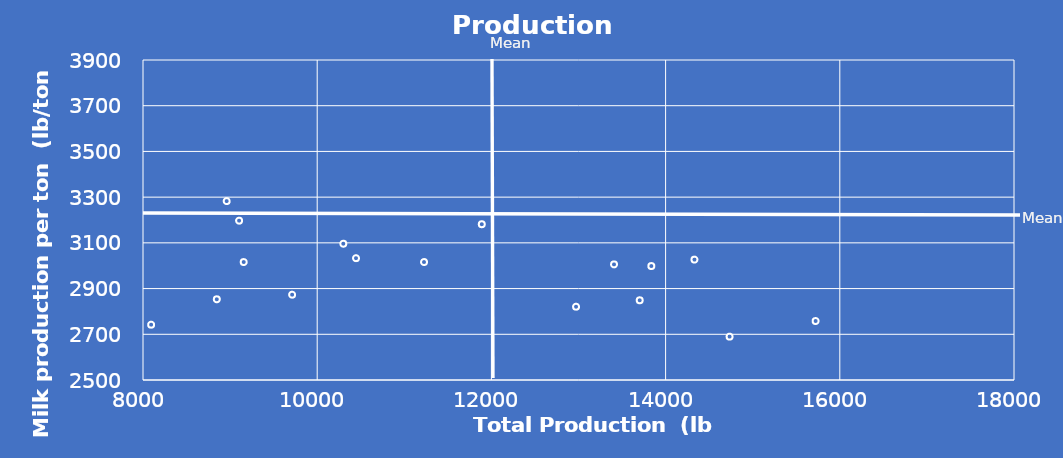
| Category | Series 0 |
|---|---|
| 11226.30080857 | 3016.111 |
| 10299.809243652 | 3096.25 |
| 14331.423669091 | 3026.75 |
| 12971.878860451 | 2820.75 |
| 13836.199827433 | 2998.5 |
| 9102.986205088 | 3197 |
| 13407.941755703 | 3005.75 |
| 9711.954492898 | 2873.25 |
| 8093.288294985 | 2742 |
| 9156.140969054 | 3016 |
| 11889.582025416 | 3181.5 |
| 14734.491967108 | 2689.75 |
| 15722.501196678 | 2758 |
| 10445.378342182 | 3033 |
| 8960.444710411 | 3282.75 |
| 13702.690481479 | 2848.75 |
| 8847.322329158 | 2853 |